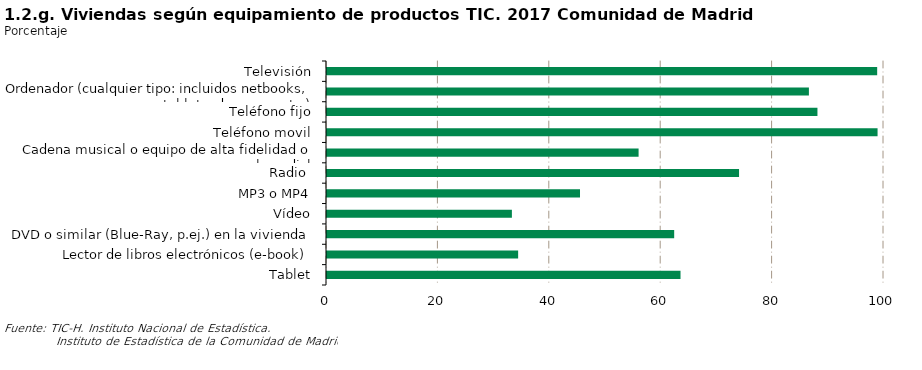
| Category | Series 0 |
|---|---|
| Televisión | 98.775 |
| Ordenador (cualquier tipo: incluidos netbooks, tablets, de mano, etc.) | 86.517 |
| Teléfono fijo | 88.051 |
| Teléfono movil | 98.844 |
| Cadena musical o equipo de alta fidelidad o laserdisk | 55.94 |
| Radio  | 73.976 |
|  MP3 o MP4 | 45.424 |
| Vídeo | 33.194 |
| DVD o similar (Blue-Ray, p.ej.) en la vivienda | 62.331 |
| Lector de libros electrónicos (e-book) | 34.317 |
| Tablet | 63.468 |